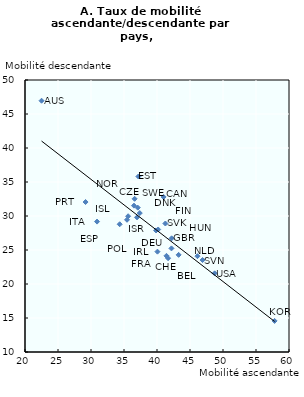
| Category | Mobilité descendante |
|---|---|
| 29.1757977637327 | 32.056 |
| 30.9172313029949 | 29.175 |
| 34.3472228477462 | 28.787 |
| 35.4572537179612 | 29.445 |
| 35.6228470343725 | 29.964 |
| 36.5126804756177 | 31.524 |
| 36.6063670724691 | 32.529 |
| 36.9702088452088 | 29.799 |
| 37.0882403140468 | 31.225 |
| 37.1818181818182 | 35.808 |
| 37.3895582329317 | 30.432 |
| 39.8545873640435 | 27.873 |
| 40.0681847778891 | 24.755 |
| 40.1754499837328 | 28.016 |
| 41.2678686180422 | 28.896 |
| 41.4332951627285 | 24.143 |
| 41.6797194363218 | 23.797 |
| 42.1887962639156 | 25.235 |
| 42.2149666196242 | 26.716 |
| 43.2762814326478 | 24.285 |
| 46.1272067735881 | 24.09 |
| 46.9039259495691 | 23.524 |
| 48.7320036983225 | 21.566 |
| 22.5071225071225 | 46.952 |
| 57.8184916915211 | 14.572 |
| 41.0 | 32.8 |